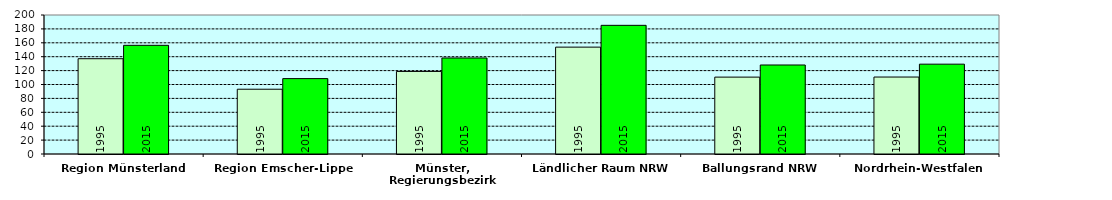
| Category | 1995 | 2015 |
|---|---|---|
| Region Münsterland | 137.115 | 156.385 |
| Region Emscher-Lippe | 93.195 | 108.457 |
| Münster, Regierungsbezirk | 118.773 | 138.137 |
| Ländlicher Raum NRW | 153.765 | 185.123 |
| Ballungsrand NRW | 110.629 | 128.075 |
| Nordrhein-Westfalen | 110.734 | 129.251 |